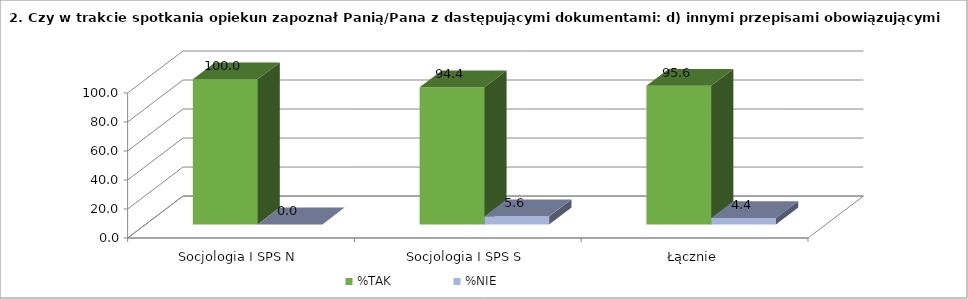
| Category | %TAK | %NIE |
|---|---|---|
| Socjologia I SPS N  | 100 | 0 |
| Socjologia I SPS S | 94.444 | 5.556 |
| Łącznie | 95.556 | 4.444 |